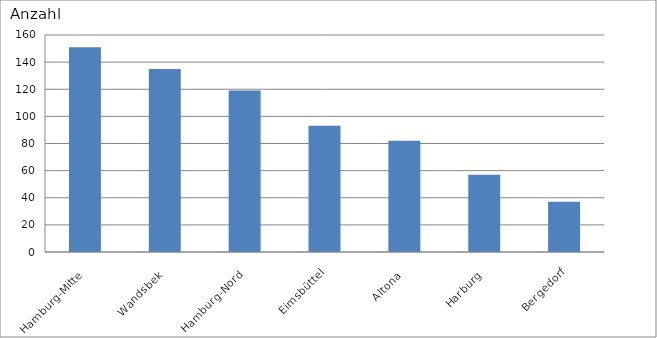
| Category | Hamburg-Mitte Wandsbek Hamburg-Nord Eimsbüttel Altona Harburg Bergedorf |
|---|---|
| Hamburg-Mitte | 151 |
| Wandsbek | 135 |
| Hamburg-Nord | 119 |
| Eimsbüttel | 93 |
| Altona | 82 |
| Harburg | 57 |
| Bergedorf | 37 |